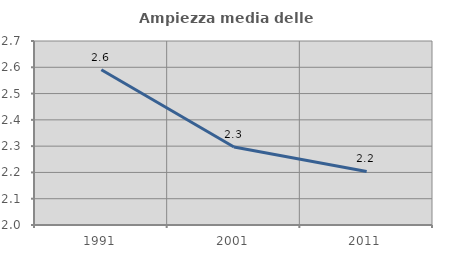
| Category | Ampiezza media delle famiglie |
|---|---|
| 1991.0 | 2.591 |
| 2001.0 | 2.297 |
| 2011.0 | 2.204 |